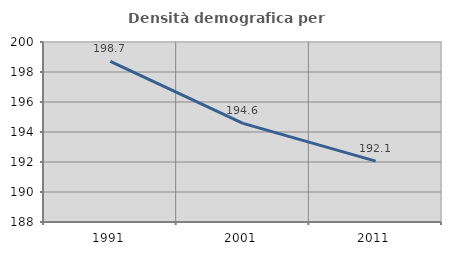
| Category | Densità demografica |
|---|---|
| 1991.0 | 198.71 |
| 2001.0 | 194.576 |
| 2011.0 | 192.062 |